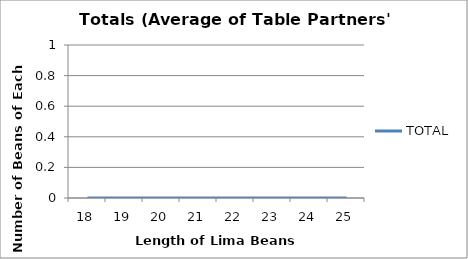
| Category | TOTAL |
|---|---|
| 18.0 | 0 |
| 19.0 | 0 |
| 20.0 | 0 |
| 21.0 | 0 |
| 22.0 | 0 |
| 23.0 | 0 |
| 24.0 | 0 |
| 25.0 | 0 |